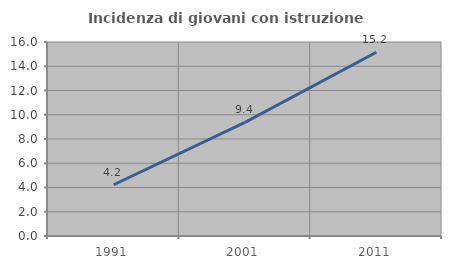
| Category | Incidenza di giovani con istruzione universitaria |
|---|---|
| 1991.0 | 4.225 |
| 2001.0 | 9.375 |
| 2011.0 | 15.152 |